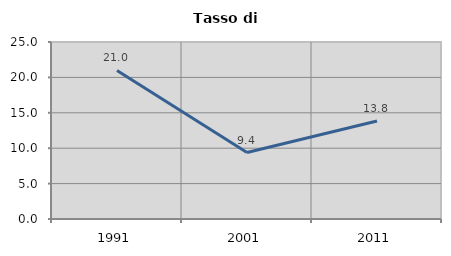
| Category | Tasso di disoccupazione   |
|---|---|
| 1991.0 | 20.985 |
| 2001.0 | 9.39 |
| 2011.0 | 13.838 |